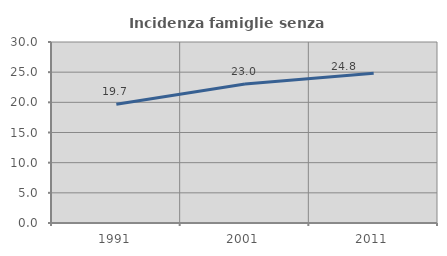
| Category | Incidenza famiglie senza nuclei |
|---|---|
| 1991.0 | 19.695 |
| 2001.0 | 23.024 |
| 2011.0 | 24.839 |